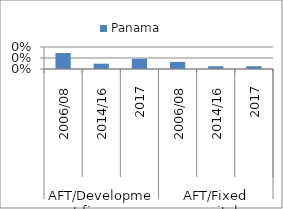
| Category | Panama |
|---|---|
| 0 | 0.003 |
| 1 | 0.001 |
| 2 | 0.002 |
| 3 | 0.001 |
| 4 | 0.001 |
| 5 | 0.001 |